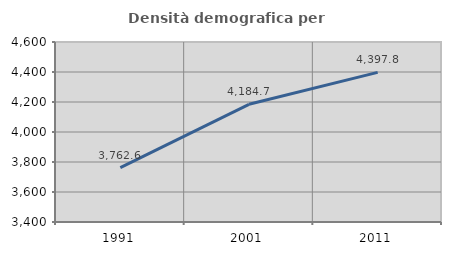
| Category | Densità demografica |
|---|---|
| 1991.0 | 3762.614 |
| 2001.0 | 4184.71 |
| 2011.0 | 4397.788 |